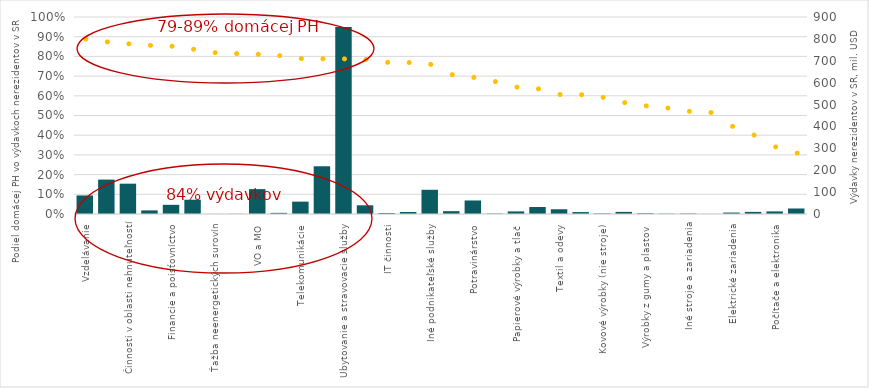
| Category | CONS_NONRES |
|---|---|
| Vzdelávanie | 84.8 |
| Umelecké, zábavné, rekreačné služby | 157.3 |
| Činnosti v oblasti nehnuteľností | 138.5 |
| VS a obrana | 16.5 |
| Financie a poisťovníctvo | 41.9 |
| Zdravotníctvo a sociálna práca | 65.2 |
| Ťažba neenergetických surovín | 0.2 |
| Ťažba energetických surovín | 0.7 |
| VO a MO | 113.7 |
| Drevo a drevené výrobky (nie nábytok) | 5.1 |
| Telekomunikácie | 56.5 |
| Preprava a skladovanie | 218.1 |
| Ubytovanie a stravovacie služby | 853.8 |
| Poľnohospodárstvo | 39.8 |
| IT činnosti | 4.6 |
| Audiovizuálne činnosti | 9.2 |
| Iné podnikateľské služby | 110.6 |
| Stavebníctvo | 13 |
| Potravinárstvo | 61.8 |
| Iné nekovové minerálne výrobky | 1.8 |
| Papierové výrobky a tlač | 11.9 |
| Iná výroba a opravy strojov | 31.9 |
| Textil a odevy | 21.7 |
| Elektrina, plyn, voda, odpad | 8.8 |
| Kovové výrobky (nie stroje) | 2.5 |
| Chemikálie a farmaceutické výrobky | 9.7 |
| Výrobky z gumy a plastov | 3.4 |
| Výroba základných kovov | 1.4 |
| Iné stroje a zariadenia | 2.2 |
| Ostatné dopravné zariadenia | 0.4 |
| Elektrické zariadenia | 6.6 |
| Motorové vozidlá | 9.7 |
| Počítače a elektronika | 11.9 |
| Koks a rafinované ropné produkty | 25.2 |